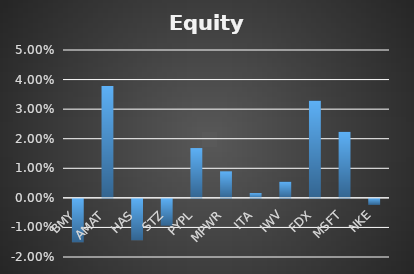
| Category | Series 0 |
|---|---|
| BMY | -0.015 |
| AMAT | 0.038 |
| HAS | -0.014 |
| STZ | -0.009 |
| PYPL | 0.017 |
| MPWR | 0.009 |
| ITA | 0.002 |
| IWV | 0.006 |
| FDX | 0.033 |
| MSFT | 0.022 |
| NKE | -0.002 |